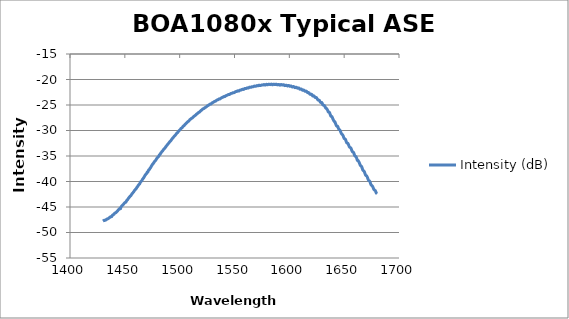
| Category | Intensity (dB) |
|---|---|
| 1430.0 | -47.754 |
| 1430.5 | -47.692 |
| 1431.0 | -47.622 |
| 1431.5 | -47.664 |
| 1432.0 | -47.561 |
| 1432.5 | -47.568 |
| 1433.0 | -47.505 |
| 1433.5 | -47.377 |
| 1434.0 | -47.339 |
| 1434.5 | -47.31 |
| 1435.0 | -47.251 |
| 1435.5 | -47.176 |
| 1436.0 | -47.06 |
| 1436.5 | -47.024 |
| 1437.0 | -46.915 |
| 1437.5 | -46.885 |
| 1438.0 | -46.884 |
| 1438.5 | -46.69 |
| 1439.0 | -46.563 |
| 1439.5 | -46.514 |
| 1440.0 | -46.43 |
| 1440.5 | -46.304 |
| 1441.0 | -46.189 |
| 1441.5 | -46.141 |
| 1442.0 | -46.066 |
| 1442.5 | -45.934 |
| 1443.0 | -45.845 |
| 1443.5 | -45.73 |
| 1444.0 | -45.569 |
| 1444.5 | -45.464 |
| 1445.0 | -45.37 |
| 1445.5 | -45.275 |
| 1446.0 | -45.347 |
| 1446.5 | -45.043 |
| 1447.0 | -44.853 |
| 1447.5 | -44.761 |
| 1448.0 | -44.623 |
| 1448.5 | -44.502 |
| 1449.0 | -44.401 |
| 1449.5 | -44.252 |
| 1450.0 | -44.141 |
| 1450.5 | -44.089 |
| 1451.0 | -44.036 |
| 1451.5 | -43.806 |
| 1452.0 | -43.659 |
| 1452.5 | -43.558 |
| 1453.0 | -43.382 |
| 1453.5 | -43.255 |
| 1454.0 | -43.1 |
| 1454.5 | -42.973 |
| 1455.0 | -42.831 |
| 1455.5 | -42.795 |
| 1456.0 | -42.587 |
| 1456.5 | -42.436 |
| 1457.0 | -42.29 |
| 1457.5 | -42.171 |
| 1458.0 | -42.047 |
| 1458.5 | -41.861 |
| 1459.0 | -41.745 |
| 1459.5 | -41.604 |
| 1460.0 | -41.433 |
| 1460.5 | -41.365 |
| 1461.0 | -41.155 |
| 1461.5 | -41.022 |
| 1462.0 | -40.859 |
| 1462.5 | -40.676 |
| 1463.0 | -40.546 |
| 1463.5 | -40.478 |
| 1464.0 | -40.215 |
| 1464.5 | -40.059 |
| 1465.0 | -39.925 |
| 1465.5 | -39.826 |
| 1466.0 | -39.606 |
| 1466.5 | -39.469 |
| 1467.0 | -39.325 |
| 1467.5 | -39.145 |
| 1468.0 | -38.969 |
| 1468.5 | -38.782 |
| 1469.0 | -38.631 |
| 1469.5 | -38.49 |
| 1470.0 | -38.404 |
| 1470.5 | -38.14 |
| 1471.0 | -38.12 |
| 1471.5 | -37.863 |
| 1472.0 | -37.668 |
| 1472.5 | -37.627 |
| 1473.0 | -37.412 |
| 1473.5 | -37.272 |
| 1474.0 | -37.072 |
| 1474.5 | -36.883 |
| 1475.0 | -36.718 |
| 1475.5 | -36.548 |
| 1476.0 | -36.443 |
| 1476.5 | -36.28 |
| 1477.0 | -36.116 |
| 1477.5 | -35.99 |
| 1478.0 | -35.881 |
| 1478.5 | -35.712 |
| 1479.0 | -35.521 |
| 1479.5 | -35.385 |
| 1480.0 | -35.259 |
| 1480.5 | -35.168 |
| 1481.0 | -34.995 |
| 1481.5 | -34.778 |
| 1482.0 | -34.723 |
| 1482.5 | -34.541 |
| 1483.0 | -34.357 |
| 1483.5 | -34.226 |
| 1484.0 | -34.08 |
| 1484.5 | -33.975 |
| 1485.0 | -33.821 |
| 1485.5 | -33.678 |
| 1486.0 | -33.565 |
| 1486.5 | -33.446 |
| 1487.0 | -33.317 |
| 1487.5 | -33.134 |
| 1488.0 | -33.014 |
| 1488.5 | -32.877 |
| 1489.0 | -32.722 |
| 1489.5 | -32.587 |
| 1490.0 | -32.494 |
| 1490.5 | -32.341 |
| 1491.0 | -32.19 |
| 1491.5 | -32.077 |
| 1492.0 | -31.974 |
| 1492.5 | -31.821 |
| 1493.0 | -31.66 |
| 1493.5 | -31.532 |
| 1494.0 | -31.414 |
| 1494.5 | -31.279 |
| 1495.0 | -31.146 |
| 1495.5 | -31.02 |
| 1496.0 | -30.909 |
| 1496.5 | -30.79 |
| 1497.0 | -30.641 |
| 1497.5 | -30.513 |
| 1498.0 | -30.432 |
| 1498.5 | -30.297 |
| 1499.0 | -30.143 |
| 1499.5 | -30.028 |
| 1500.0 | -29.922 |
| 1500.5 | -29.794 |
| 1501.0 | -29.677 |
| 1501.5 | -29.569 |
| 1502.0 | -29.486 |
| 1502.5 | -29.376 |
| 1503.0 | -29.227 |
| 1503.5 | -29.113 |
| 1504.0 | -29.05 |
| 1504.5 | -28.922 |
| 1505.0 | -28.789 |
| 1505.5 | -28.689 |
| 1506.0 | -28.591 |
| 1506.5 | -28.481 |
| 1507.0 | -28.366 |
| 1507.5 | -28.264 |
| 1508.0 | -28.192 |
| 1508.5 | -28.099 |
| 1509.0 | -27.957 |
| 1509.5 | -27.838 |
| 1510.0 | -27.764 |
| 1510.5 | -27.659 |
| 1511.0 | -27.607 |
| 1511.5 | -27.531 |
| 1512.0 | -27.44 |
| 1512.5 | -27.35 |
| 1513.0 | -27.234 |
| 1513.5 | -27.147 |
| 1514.0 | -27.068 |
| 1514.5 | -26.989 |
| 1515.0 | -26.873 |
| 1515.5 | -26.756 |
| 1516.0 | -26.7 |
| 1516.5 | -26.618 |
| 1517.0 | -26.511 |
| 1517.5 | -26.445 |
| 1518.0 | -26.392 |
| 1518.5 | -26.275 |
| 1519.0 | -26.155 |
| 1519.5 | -26.053 |
| 1520.0 | -26.003 |
| 1520.5 | -25.904 |
| 1521.0 | -25.812 |
| 1521.5 | -25.733 |
| 1522.0 | -25.693 |
| 1522.5 | -25.642 |
| 1523.0 | -25.535 |
| 1523.5 | -25.447 |
| 1524.0 | -25.404 |
| 1524.5 | -25.318 |
| 1525.0 | -25.237 |
| 1525.5 | -25.131 |
| 1526.0 | -25.088 |
| 1526.5 | -25.019 |
| 1527.0 | -24.943 |
| 1527.5 | -24.853 |
| 1528.0 | -24.803 |
| 1528.5 | -24.799 |
| 1529.0 | -24.705 |
| 1529.5 | -24.605 |
| 1530.0 | -24.534 |
| 1530.5 | -24.491 |
| 1531.0 | -24.421 |
| 1531.5 | -24.342 |
| 1532.0 | -24.289 |
| 1532.5 | -24.263 |
| 1533.0 | -24.218 |
| 1533.5 | -24.108 |
| 1534.0 | -24.031 |
| 1534.5 | -24.001 |
| 1535.0 | -23.95 |
| 1535.5 | -23.873 |
| 1536.0 | -23.805 |
| 1536.5 | -23.814 |
| 1537.0 | -23.781 |
| 1537.5 | -23.682 |
| 1538.0 | -23.598 |
| 1538.5 | -23.542 |
| 1539.0 | -23.518 |
| 1539.5 | -23.457 |
| 1540.0 | -23.375 |
| 1540.5 | -23.345 |
| 1541.0 | -23.359 |
| 1541.5 | -23.312 |
| 1542.0 | -23.208 |
| 1542.5 | -23.139 |
| 1543.0 | -23.117 |
| 1543.5 | -23.067 |
| 1544.0 | -22.992 |
| 1544.5 | -22.946 |
| 1545.0 | -22.953 |
| 1545.5 | -22.933 |
| 1546.0 | -22.848 |
| 1546.5 | -22.756 |
| 1547.0 | -22.725 |
| 1547.5 | -22.715 |
| 1548.0 | -22.662 |
| 1548.5 | -22.591 |
| 1549.0 | -22.587 |
| 1549.5 | -22.587 |
| 1550.0 | -22.539 |
| 1550.5 | -22.45 |
| 1551.0 | -22.385 |
| 1551.5 | -22.366 |
| 1552.0 | -22.352 |
| 1552.5 | -22.274 |
| 1553.0 | -22.225 |
| 1553.5 | -22.247 |
| 1554.0 | -22.258 |
| 1554.5 | -22.174 |
| 1555.0 | -22.08 |
| 1555.5 | -22.056 |
| 1556.0 | -22.056 |
| 1556.5 | -22.018 |
| 1557.0 | -21.937 |
| 1557.5 | -21.912 |
| 1558.0 | -21.939 |
| 1558.5 | -21.929 |
| 1559.0 | -21.826 |
| 1559.5 | -21.759 |
| 1560.0 | -21.78 |
| 1560.5 | -21.772 |
| 1561.0 | -21.711 |
| 1561.5 | -21.651 |
| 1562.0 | -21.643 |
| 1562.5 | -21.673 |
| 1563.0 | -21.634 |
| 1563.5 | -21.531 |
| 1564.0 | -21.49 |
| 1564.5 | -21.532 |
| 1565.0 | -21.537 |
| 1565.5 | -21.444 |
| 1566.0 | -21.414 |
| 1566.5 | -21.445 |
| 1567.0 | -21.435 |
| 1567.5 | -21.358 |
| 1568.0 | -21.292 |
| 1568.5 | -21.303 |
| 1569.0 | -21.346 |
| 1569.5 | -21.321 |
| 1570.0 | -21.241 |
| 1570.5 | -21.191 |
| 1571.0 | -21.237 |
| 1571.5 | -21.241 |
| 1572.0 | -21.153 |
| 1572.5 | -21.118 |
| 1573.0 | -21.173 |
| 1573.5 | -21.203 |
| 1574.0 | -21.163 |
| 1574.5 | -21.09 |
| 1575.0 | -21.057 |
| 1575.5 | -21.078 |
| 1576.0 | -21.088 |
| 1576.5 | -21.017 |
| 1577.0 | -20.988 |
| 1577.5 | -21.06 |
| 1578.0 | -21.103 |
| 1578.5 | -21.035 |
| 1579.0 | -20.95 |
| 1579.5 | -20.978 |
| 1580.0 | -21.038 |
| 1580.5 | -21.012 |
| 1581.0 | -20.947 |
| 1581.5 | -20.924 |
| 1582.0 | -20.969 |
| 1582.5 | -21.006 |
| 1583.0 | -20.96 |
| 1583.5 | -20.897 |
| 1584.0 | -20.951 |
| 1584.5 | -21.033 |
| 1585.0 | -21.014 |
| 1585.5 | -20.924 |
| 1586.0 | -20.912 |
| 1586.5 | -20.973 |
| 1587.0 | -20.999 |
| 1587.5 | -20.946 |
| 1588.0 | -20.91 |
| 1588.5 | -20.972 |
| 1589.0 | -21.047 |
| 1589.5 | -21.047 |
| 1590.0 | -20.979 |
| 1590.5 | -20.968 |
| 1591.0 | -21.06 |
| 1591.5 | -21.11 |
| 1592.0 | -21.038 |
| 1592.5 | -20.977 |
| 1593.0 | -21.021 |
| 1593.5 | -21.089 |
| 1594.0 | -21.084 |
| 1594.5 | -21.02 |
| 1595.0 | -21.047 |
| 1595.5 | -21.15 |
| 1596.0 | -21.204 |
| 1596.5 | -21.157 |
| 1597.0 | -21.109 |
| 1597.5 | -21.154 |
| 1598.0 | -21.243 |
| 1598.5 | -21.265 |
| 1599.0 | -21.193 |
| 1599.5 | -21.172 |
| 1600.0 | -21.271 |
| 1600.5 | -21.347 |
| 1601.0 | -21.297 |
| 1601.5 | -21.26 |
| 1602.0 | -21.335 |
| 1602.5 | -21.447 |
| 1603.0 | -21.465 |
| 1603.5 | -21.4 |
| 1604.0 | -21.394 |
| 1604.5 | -21.484 |
| 1605.0 | -21.589 |
| 1605.5 | -21.585 |
| 1606.0 | -21.526 |
| 1606.5 | -21.538 |
| 1607.0 | -21.647 |
| 1607.5 | -21.704 |
| 1608.0 | -21.662 |
| 1608.5 | -21.652 |
| 1609.0 | -21.765 |
| 1609.5 | -21.889 |
| 1610.0 | -21.894 |
| 1610.5 | -21.848 |
| 1611.0 | -21.884 |
| 1611.5 | -22.01 |
| 1612.0 | -22.095 |
| 1612.5 | -22.097 |
| 1613.0 | -22.067 |
| 1613.5 | -22.122 |
| 1614.0 | -22.245 |
| 1614.5 | -22.323 |
| 1615.0 | -22.286 |
| 1615.5 | -22.285 |
| 1616.0 | -22.423 |
| 1616.5 | -22.563 |
| 1617.0 | -22.576 |
| 1617.5 | -22.549 |
| 1618.0 | -22.632 |
| 1618.5 | -22.803 |
| 1619.0 | -22.91 |
| 1619.5 | -22.91 |
| 1620.0 | -22.883 |
| 1620.5 | -22.958 |
| 1621.0 | -23.139 |
| 1621.5 | -23.253 |
| 1622.0 | -23.221 |
| 1622.5 | -23.215 |
| 1623.0 | -23.368 |
| 1623.5 | -23.516 |
| 1624.0 | -23.547 |
| 1624.5 | -23.528 |
| 1625.0 | -23.646 |
| 1625.5 | -23.827 |
| 1626.0 | -23.985 |
| 1626.5 | -24.04 |
| 1627.0 | -24.047 |
| 1627.5 | -24.123 |
| 1628.0 | -24.348 |
| 1628.5 | -24.492 |
| 1629.0 | -24.507 |
| 1629.5 | -24.502 |
| 1630.0 | -24.677 |
| 1630.5 | -24.942 |
| 1631.0 | -25.032 |
| 1631.5 | -25.058 |
| 1632.0 | -25.144 |
| 1632.5 | -25.312 |
| 1633.0 | -25.528 |
| 1633.5 | -25.648 |
| 1634.0 | -25.715 |
| 1634.5 | -25.862 |
| 1635.0 | -26.068 |
| 1635.5 | -26.341 |
| 1636.0 | -26.407 |
| 1636.5 | -26.441 |
| 1637.0 | -26.681 |
| 1637.5 | -26.983 |
| 1638.0 | -27.214 |
| 1638.5 | -27.236 |
| 1639.0 | -27.334 |
| 1639.5 | -27.622 |
| 1640.0 | -27.866 |
| 1640.5 | -28.077 |
| 1641.0 | -28.237 |
| 1641.5 | -28.29 |
| 1642.0 | -28.568 |
| 1642.5 | -28.842 |
| 1643.0 | -29.08 |
| 1643.5 | -29.187 |
| 1644.0 | -29.178 |
| 1644.5 | -29.405 |
| 1645.0 | -29.693 |
| 1645.5 | -29.814 |
| 1646.0 | -29.891 |
| 1646.5 | -30.085 |
| 1647.0 | -30.375 |
| 1647.5 | -30.604 |
| 1648.0 | -30.722 |
| 1648.5 | -30.814 |
| 1649.0 | -31.011 |
| 1649.5 | -31.302 |
| 1650.0 | -31.547 |
| 1650.5 | -31.634 |
| 1651.0 | -31.688 |
| 1651.5 | -31.898 |
| 1652.0 | -32.244 |
| 1652.5 | -32.458 |
| 1653.0 | -32.489 |
| 1653.5 | -32.557 |
| 1654.0 | -32.795 |
| 1654.5 | -33.087 |
| 1655.0 | -33.262 |
| 1655.5 | -33.341 |
| 1656.0 | -33.429 |
| 1656.5 | -33.625 |
| 1657.0 | -33.933 |
| 1657.5 | -34.153 |
| 1658.0 | -34.213 |
| 1658.5 | -34.298 |
| 1659.0 | -34.537 |
| 1659.5 | -34.855 |
| 1660.0 | -35.015 |
| 1660.5 | -35.08 |
| 1661.0 | -35.217 |
| 1661.5 | -35.492 |
| 1662.0 | -35.844 |
| 1662.5 | -35.853 |
| 1663.0 | -36.004 |
| 1663.5 | -36.185 |
| 1664.0 | -36.441 |
| 1664.5 | -36.724 |
| 1665.0 | -36.891 |
| 1665.5 | -36.979 |
| 1666.0 | -37.123 |
| 1666.5 | -37.424 |
| 1667.0 | -37.735 |
| 1667.5 | -37.876 |
| 1668.0 | -37.943 |
| 1668.5 | -38.129 |
| 1669.0 | -38.44 |
| 1669.5 | -38.723 |
| 1670.0 | -38.847 |
| 1670.5 | -38.913 |
| 1671.0 | -39.089 |
| 1671.5 | -39.399 |
| 1672.0 | -39.677 |
| 1672.5 | -39.828 |
| 1673.0 | -39.888 |
| 1673.5 | -40.049 |
| 1674.0 | -40.351 |
| 1674.5 | -40.63 |
| 1675.0 | -40.777 |
| 1675.5 | -40.833 |
| 1676.0 | -40.993 |
| 1676.5 | -41.242 |
| 1677.0 | -41.526 |
| 1677.5 | -41.649 |
| 1678.0 | -41.716 |
| 1678.5 | -41.829 |
| 1679.0 | -42.1 |
| 1679.5 | -42.32 |
| 1680.0 | -42.412 |